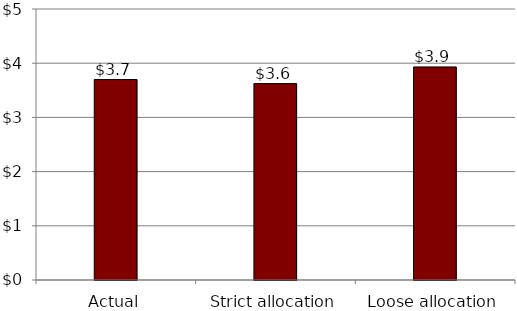
| Category | Series 0 |
|---|---|
| Actual | 3698755613.899 |
| Strict allocation | 3623622656.35 |
| Loose allocation | 3930792250.594 |